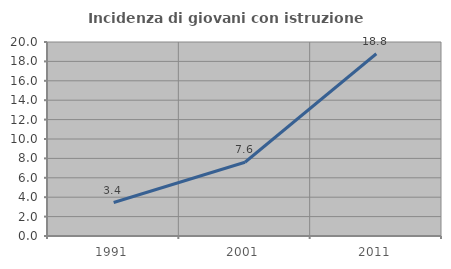
| Category | Incidenza di giovani con istruzione universitaria |
|---|---|
| 1991.0 | 3.448 |
| 2001.0 | 7.6 |
| 2011.0 | 18.791 |